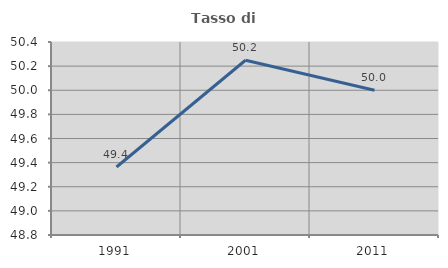
| Category | Tasso di occupazione   |
|---|---|
| 1991.0 | 49.364 |
| 2001.0 | 50.249 |
| 2011.0 | 50 |